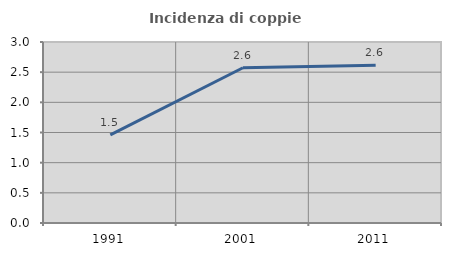
| Category | Incidenza di coppie miste |
|---|---|
| 1991.0 | 1.461 |
| 2001.0 | 2.573 |
| 2011.0 | 2.614 |